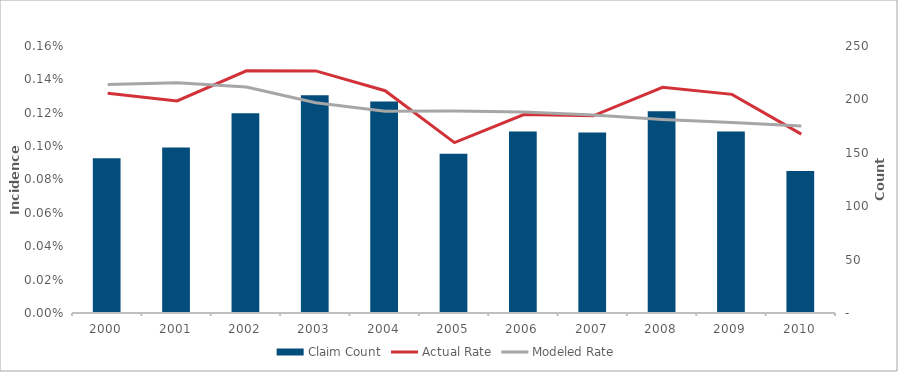
| Category | Claim Count |
|---|---|
| 2000.0 | 145 |
| 2001.0 | 155 |
| 2002.0 | 187 |
| 2003.0 | 204 |
| 2004.0 | 198 |
| 2005.0 | 149 |
| 2006.0 | 170 |
| 2007.0 | 169 |
| 2008.0 | 189 |
| 2009.0 | 170 |
| 2010.0 | 133 |